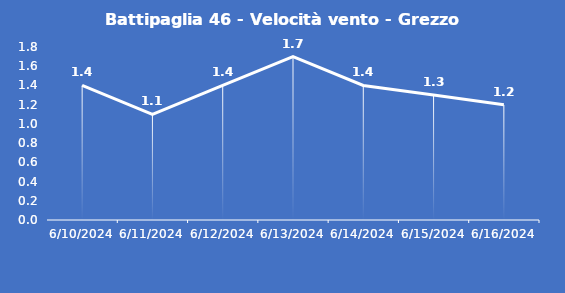
| Category | Battipaglia 46 - Velocità vento - Grezzo (m/s) |
|---|---|
| 6/10/24 | 1.4 |
| 6/11/24 | 1.1 |
| 6/12/24 | 1.4 |
| 6/13/24 | 1.7 |
| 6/14/24 | 1.4 |
| 6/15/24 | 1.3 |
| 6/16/24 | 1.2 |